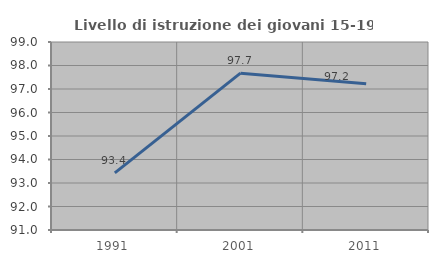
| Category | Livello di istruzione dei giovani 15-19 anni |
|---|---|
| 1991.0 | 93.431 |
| 2001.0 | 97.674 |
| 2011.0 | 97.222 |